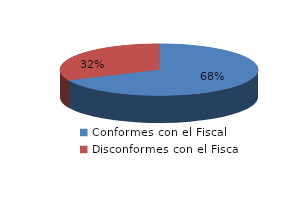
| Category | Series 0 |
|---|---|
| 0 | 235 |
| 1 | 110 |